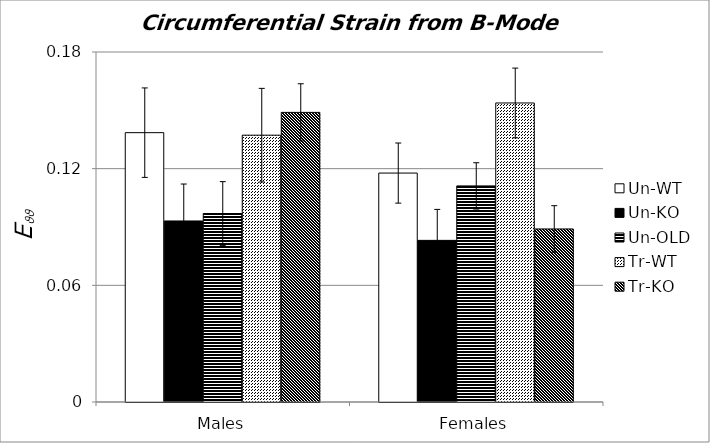
| Category | Un-WT | Un-KO | Un-OLD | Tr-WT | Tr-KO |
|---|---|---|---|---|---|
| 0 | 0.139 | 0.093 | 0.097 | 0.137 | 0.149 |
| 1 | 0.118 | 0.083 | 0.111 | 0.154 | 0.089 |